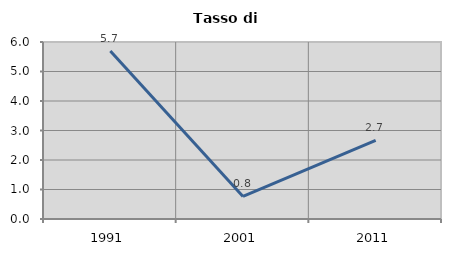
| Category | Tasso di disoccupazione   |
|---|---|
| 1991.0 | 5.691 |
| 2001.0 | 0.763 |
| 2011.0 | 2.667 |